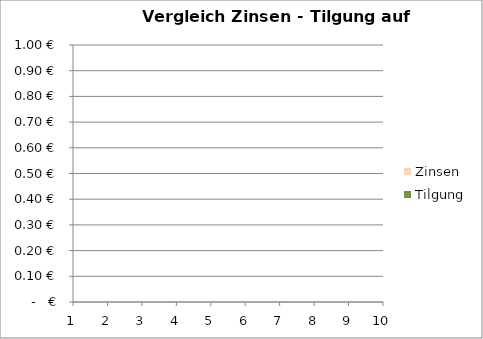
| Category | Tilgung | Zinsen |
|---|---|---|
| 0 | 0 | 0 |
| 1 | 0 | 0 |
| 2 | 0 | 0 |
| 3 | 0 | 0 |
| 4 | 0 | 0 |
| 5 | 0 | 0 |
| 6 | 0 | 0 |
| 7 | 0 | 0 |
| 8 | 0 | 0 |
| 9 | 0 | 0 |